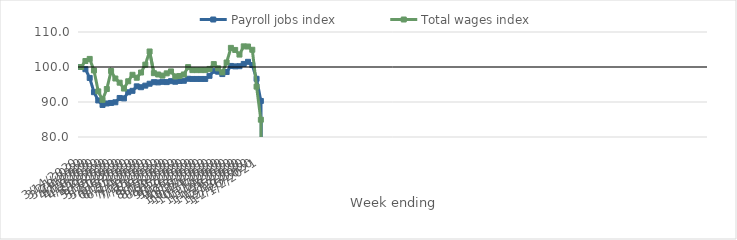
| Category | Payroll jobs index | Total wages index |
|---|---|---|
| 14/03/2020 | 100 | 100 |
| 21/03/2020 | 99.37 | 101.712 |
| 28/03/2020 | 96.876 | 102.31 |
| 04/04/2020 | 92.807 | 99.015 |
| 11/04/2020 | 90.441 | 93.036 |
| 18/04/2020 | 89.154 | 90.632 |
| 25/04/2020 | 89.581 | 93.707 |
| 02/05/2020 | 89.732 | 98.864 |
| 09/05/2020 | 89.924 | 96.712 |
| 16/05/2020 | 91.148 | 95.52 |
| 23/05/2020 | 91.03 | 93.844 |
| 30/05/2020 | 92.782 | 95.921 |
| 06/06/2020 | 93.192 | 97.777 |
| 13/06/2020 | 94.472 | 96.933 |
| 20/06/2020 | 94.225 | 98.421 |
| 27/06/2020 | 94.676 | 100.672 |
| 04/07/2020 | 95.219 | 104.435 |
| 11/07/2020 | 95.662 | 98.241 |
| 18/07/2020 | 95.597 | 97.859 |
| 25/07/2020 | 95.763 | 97.553 |
| 01/08/2020 | 95.685 | 98.185 |
| 08/08/2020 | 95.954 | 98.737 |
| 15/08/2020 | 95.789 | 97.305 |
| 22/08/2020 | 96.014 | 97.432 |
| 29/08/2020 | 96.062 | 97.865 |
| 05/09/2020 | 96.636 | 99.968 |
| 12/09/2020 | 96.585 | 99.11 |
| 19/09/2020 | 96.585 | 99.11 |
| 26/09/2020 | 96.585 | 99.11 |
| 03/10/2020 | 96.585 | 99.11 |
| 10/10/2020 | 97.48 | 99.443 |
| 17/10/2020 | 98.911 | 100.833 |
| 24/10/2020 | 98.654 | 99.616 |
| 31/10/2020 | 97.981 | 98.457 |
| 07/11/2020 | 98.563 | 101.293 |
| 14/11/2020 | 100.299 | 105.465 |
| 21/11/2020 | 100.179 | 104.872 |
| 28/11/2020 | 100.232 | 103.548 |
| 05/12/2020 | 100.878 | 105.9 |
| 12/12/2020 | 101.481 | 105.849 |
| 19/12/2020 | 100.576 | 104.927 |
| 26/12/2020 | 96.626 | 94.392 |
| 02/01/2021 | 90.297 | 84.944 |